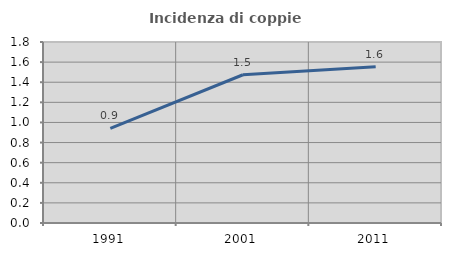
| Category | Incidenza di coppie miste |
|---|---|
| 1991.0 | 0.94 |
| 2001.0 | 1.474 |
| 2011.0 | 1.554 |